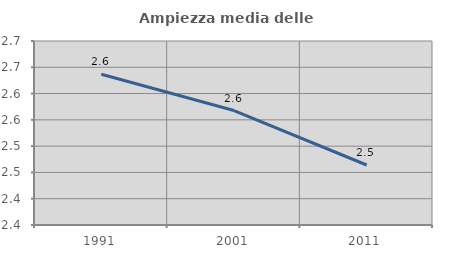
| Category | Ampiezza media delle famiglie |
|---|---|
| 1991.0 | 2.637 |
| 2001.0 | 2.568 |
| 2011.0 | 2.464 |